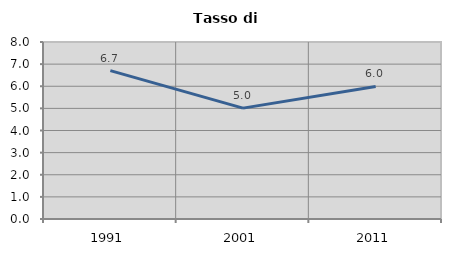
| Category | Tasso di disoccupazione   |
|---|---|
| 1991.0 | 6.704 |
| 2001.0 | 5.012 |
| 2011.0 | 5.991 |